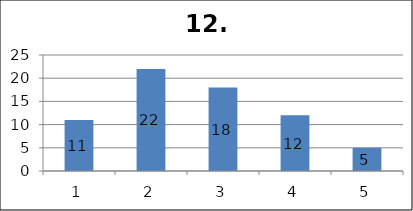
| Category | Series 1 |
|---|---|
| 0 | 11 |
| 1 | 22 |
| 2 | 18 |
| 3 | 12 |
| 4 | 5 |